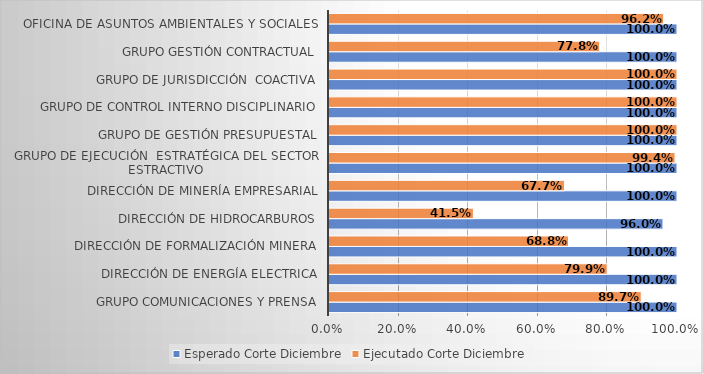
| Category | Esperado Corte Diciembre | Ejecutado Corte Diciembre |
|---|---|---|
| Grupo Comunicaciones y Prensa | 1 | 0.897 |
| Dirección de energía electrica | 1 | 0.799 |
| Dirección de Formalización Minera | 1 | 0.688 |
| Dirección de hidrocarburos | 0.96 | 0.415 |
| Dirección de Minería Empresarial | 1 | 0.677 |
| Grupo de Ejecución  Estratégica del Sector Estractivo | 1 | 0.994 |
| Grupo de Gestión presupuestal | 1 | 1 |
| Grupo de Control Interno Disciplinario | 1 | 1 |
| Grupo de Jurisdicción  Coactiva | 1 | 1 |
| Grupo Gestión Contractual | 1 | 0.778 |
| Oficina de Asuntos Ambientales y Sociales | 1 | 0.962 |